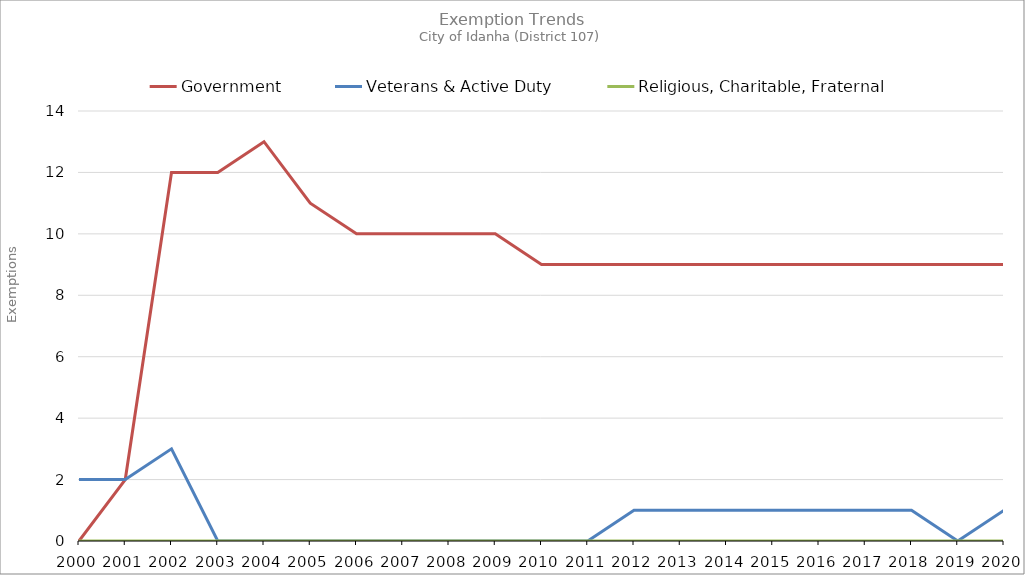
| Category | Government | Veterans & Active Duty | Religious, Charitable, Fraternal |
|---|---|---|---|
| 2000.0 | 0 | 2 | 0 |
| 2001.0 | 2 | 2 | 0 |
| 2002.0 | 12 | 3 | 0 |
| 2003.0 | 12 | 0 | 0 |
| 2004.0 | 13 | 0 | 0 |
| 2005.0 | 11 | 0 | 0 |
| 2006.0 | 10 | 0 | 0 |
| 2007.0 | 10 | 0 | 0 |
| 2008.0 | 10 | 0 | 0 |
| 2009.0 | 10 | 0 | 0 |
| 2010.0 | 9 | 0 | 0 |
| 2011.0 | 9 | 0 | 0 |
| 2012.0 | 9 | 1 | 0 |
| 2013.0 | 9 | 1 | 0 |
| 2014.0 | 9 | 1 | 0 |
| 2015.0 | 9 | 1 | 0 |
| 2016.0 | 9 | 1 | 0 |
| 2017.0 | 9 | 1 | 0 |
| 2018.0 | 9 | 1 | 0 |
| 2019.0 | 9 | 0 | 0 |
| 2020.0 | 9 | 1 | 0 |